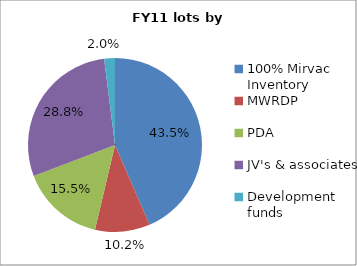
| Category | Series 0 |
|---|---|
| 100% Mirvac Inventory | 0.435 |
| MWRDP | 0.102 |
| PDA | 0.155 |
| JV's & associates | 0.288 |
| Development funds | 0.02 |